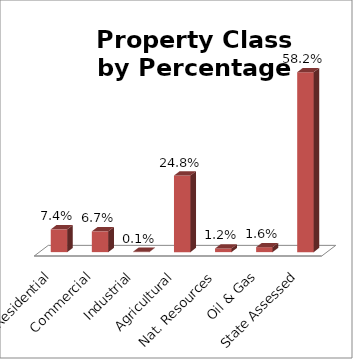
| Category | Series 0 |
|---|---|
| Residential | 0.074 |
| Commercial | 0.067 |
| Industrial | 0.001 |
| Agricultural | 0.248 |
| Nat. Resources | 0.012 |
| Oil & Gas | 0.016 |
| State Assessed | 0.582 |